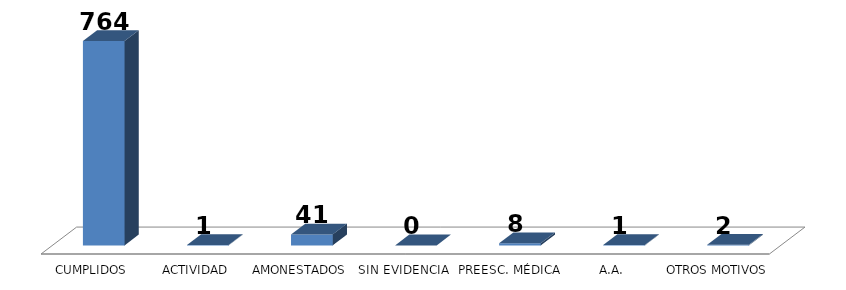
| Category | Series 0 |
|---|---|
| CUMPLIDOS | 764 |
| ACTIVIDAD | 1 |
| AMONESTADOS | 41 |
| SIN EVIDENCIA | 0 |
| PREESC. MÉDICA | 8 |
| A.A. | 1 |
| OTROS MOTIVOS | 2 |